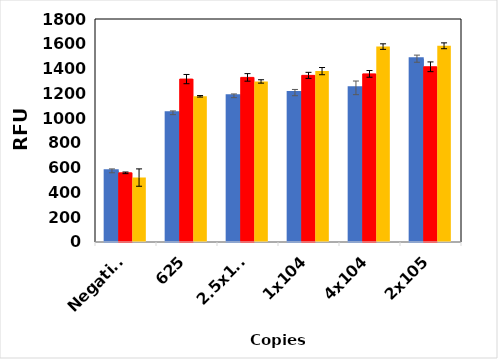
| Category | AFU_N1 primer set | AFU_N2 primer set | AFU_N3 primer set |
|---|---|---|---|
| Negative | 574.333 | 558.333 | 520 |
| 625 | 1043 | 1315 | 1176 |
| 2.5x103 | 1180 | 1328.667 | 1296 |
| 1x104 | 1206 | 1345 | 1379.333 |
| 4x104 | 1244.333 | 1357 | 1577.333 |
| 2x105 | 1479.667 | 1414.333 | 1583.667 |